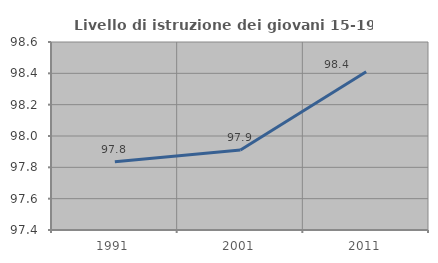
| Category | Livello di istruzione dei giovani 15-19 anni |
|---|---|
| 1991.0 | 97.835 |
| 2001.0 | 97.911 |
| 2011.0 | 98.41 |